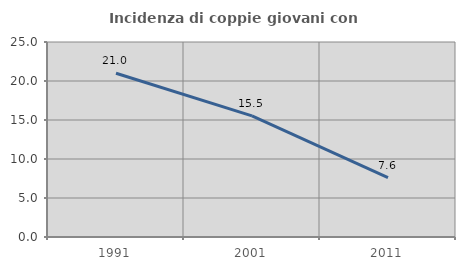
| Category | Incidenza di coppie giovani con figli |
|---|---|
| 1991.0 | 20.989 |
| 2001.0 | 15.53 |
| 2011.0 | 7.627 |